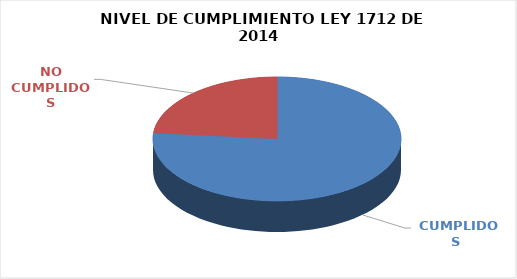
| Category | Series 0 |
|---|---|
|  CUMPLIDOS | 88 |
| NO CUMPLIDOS | 27 |